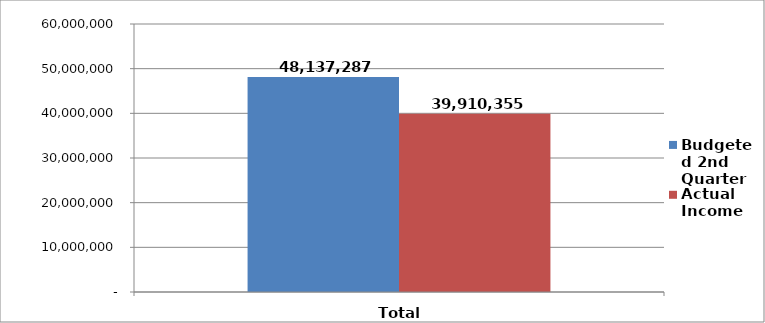
| Category | Budgeted 2nd Quarter | Actual Income |
|---|---|---|
| 0 | 48137286.667 | 39910355 |